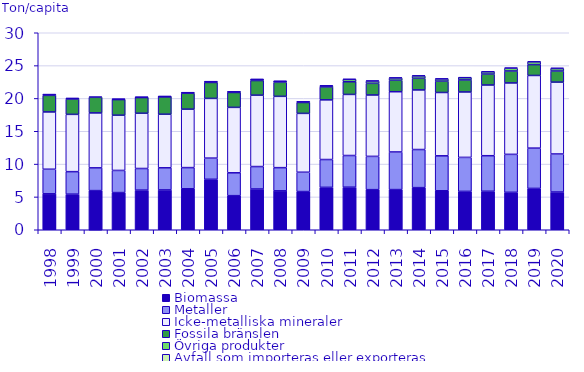
| Category | Biomassa | Metaller | Icke-metalliska mineraler | Fossila bränslen | Övriga produkter | Avfall som importeras eller exporteras |
|---|---|---|---|---|---|---|
| 1998.0 | 5.474 | 3.742 | 8.726 | 2.52 | 0.122 | 0 |
| 1999.0 | 5.42 | 3.429 | 8.722 | 2.341 | 0.088 | 0 |
| 2000.0 | 5.961 | 3.466 | 8.366 | 2.374 | 0.099 | 0 |
| 2001.0 | 5.663 | 3.37 | 8.413 | 2.377 | 0.062 | 0 |
| 2002.0 | 6.033 | 3.296 | 8.412 | 2.386 | 0.059 | 0 |
| 2003.0 | 6.065 | 3.368 | 8.159 | 2.656 | 0.053 | 0 |
| 2004.0 | 6.24 | 3.224 | 8.9 | 2.428 | 0.078 | 0 |
| 2005.0 | 7.684 | 3.224 | 9.095 | 2.423 | 0.123 | 0.002 |
| 2006.0 | 5.19 | 3.483 | 9.965 | 2.264 | 0.111 | 0.001 |
| 2007.0 | 6.204 | 3.419 | 10.873 | 2.228 | 0.178 | 0.001 |
| 2008.0 | 5.927 | 3.531 | 10.86 | 2.134 | 0.167 | 0.003 |
| 2009.0 | 5.813 | 2.947 | 8.961 | 1.656 | 0.11 | 0.017 |
| 2010.0 | 6.457 | 4.238 | 9.087 | 1.971 | 0.168 | 0.031 |
| 2011.0 | 6.481 | 4.824 | 9.303 | 1.931 | 0.358 | 0.049 |
| 2012.0 | 6.107 | 5.069 | 9.347 | 1.778 | 0.343 | 0.056 |
| 2013.0 | 6.115 | 5.73 | 9.173 | 1.747 | 0.347 | 0.058 |
| 2014.0 | 6.413 | 5.804 | 9.078 | 1.773 | 0.362 | 0.069 |
| 2015.0 | 5.935 | 5.324 | 9.644 | 1.733 | 0.325 | 0.068 |
| 2016.0 | 5.842 | 5.178 | 9.965 | 1.831 | 0.341 | 0.072 |
| 2017.0 | 5.865 | 5.409 | 10.768 | 1.662 | 0.349 | 0.075 |
| 2018.0 | 5.703 | 5.778 | 10.874 | 1.824 | 0.421 | 0.072 |
| 2019.0 | 6.294 | 6.138 | 11.064 | 1.651 | 0.424 | 0.075 |
| 2020.0 | 5.745 | 5.793 | 10.941 | 1.691 | 0.382 | 0.096 |